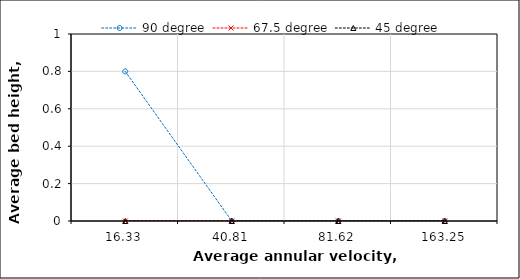
| Category | 90 degree | 67.5 degree | 45 degree |
|---|---|---|---|
| 16.33 | 0.8 | 0 | 0 |
| 40.81 | 0 | 0 | 0 |
| 81.62 | 0 | 0 | 0 |
| 163.25 | 0 | 0 | 0 |